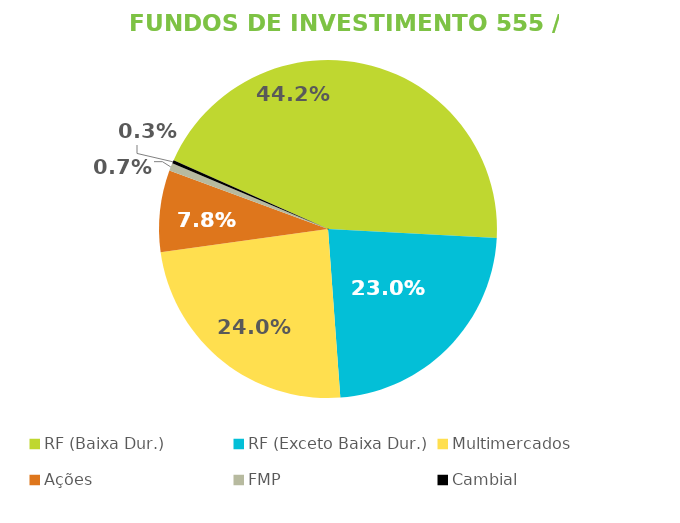
| Category | Fundos de Investimento 555 / FMP |
|---|---|
| RF (Baixa Dur.) | 0.442 |
| RF (Exceto Baixa Dur.) | 0.23 |
| Multimercados | 0.24 |
| Ações | 0.078 |
| FMP | 0.007 |
| Cambial | 0.003 |